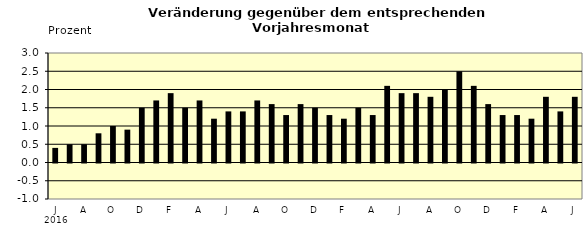
| Category | Series 0 |
|---|---|
| 0 | 0.4 |
| 1 | 0.5 |
| 2 | 0.5 |
| 3 | 0.8 |
| 4 | 1 |
| 5 | 0.9 |
| 6 | 1.5 |
| 7 | 1.7 |
| 8 | 1.9 |
| 9 | 1.5 |
| 10 | 1.7 |
| 11 | 1.2 |
| 12 | 1.4 |
| 13 | 1.4 |
| 14 | 1.7 |
| 15 | 1.6 |
| 16 | 1.3 |
| 17 | 1.6 |
| 18 | 1.5 |
| 19 | 1.3 |
| 20 | 1.2 |
| 21 | 1.5 |
| 22 | 1.3 |
| 23 | 2.1 |
| 24 | 1.9 |
| 25 | 1.9 |
| 26 | 1.8 |
| 27 | 2 |
| 28 | 2.5 |
| 29 | 2.1 |
| 30 | 1.6 |
| 31 | 1.3 |
| 32 | 1.3 |
| 33 | 1.2 |
| 34 | 1.8 |
| 35 | 1.4 |
| 36 | 1.8 |